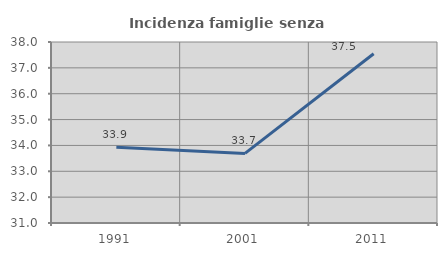
| Category | Incidenza famiglie senza nuclei |
|---|---|
| 1991.0 | 33.926 |
| 2001.0 | 33.691 |
| 2011.0 | 37.548 |